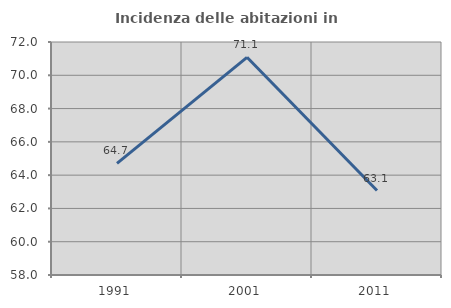
| Category | Incidenza delle abitazioni in proprietà  |
|---|---|
| 1991.0 | 64.706 |
| 2001.0 | 71.081 |
| 2011.0 | 63.077 |